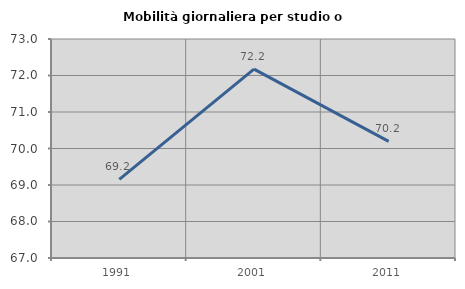
| Category | Mobilità giornaliera per studio o lavoro |
|---|---|
| 1991.0 | 69.153 |
| 2001.0 | 72.174 |
| 2011.0 | 70.197 |